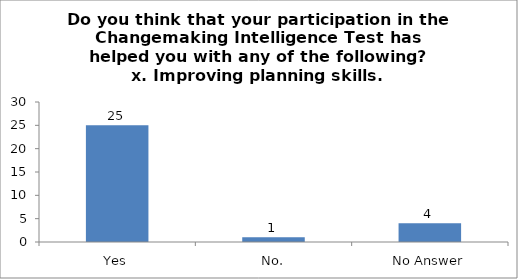
| Category | Do you think that your participation in the Changemaking Intelligence Test has helped you with any of the following?
x. Improving planning skills. |
|---|---|
| Yes | 25 |
| No. | 1 |
| No Answer | 4 |